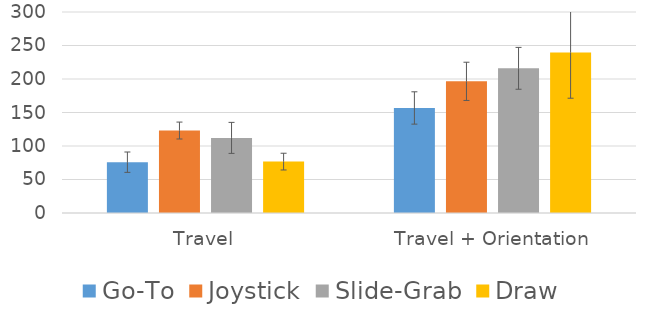
| Category | Go-To | Joystick | Slide-Grab | Draw |
|---|---|---|---|---|
| Travel | 75.855 | 123.08 | 112.121 | 76.709 |
| Travel + Orientation | 156.756 | 196.516 | 215.941 | 239.422 |